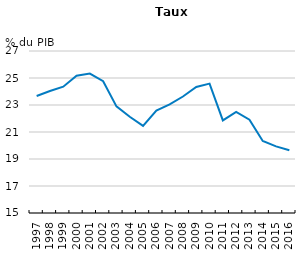
| Category | Tunisie |
|---|---|
| 1997.0 | 23.671 |
| 1998.0 | 24.034 |
| 1999.0 | 24.355 |
| 2000.0 | 25.167 |
| 2001.0 | 25.325 |
| 2002.0 | 24.764 |
| 2003.0 | 22.9 |
| 2004.0 | 22.129 |
| 2005.0 | 21.45 |
| 2006.0 | 22.584 |
| 2007.0 | 23.043 |
| 2008.0 | 23.629 |
| 2009.0 | 24.333 |
| 2010.0 | 24.586 |
| 2011.0 | 21.857 |
| 2012.0 | 22.492 |
| 2013.0 | 21.91 |
| 2014.0 | 20.337 |
| 2015.0 | 19.937 |
| 2016.0 | 19.649 |